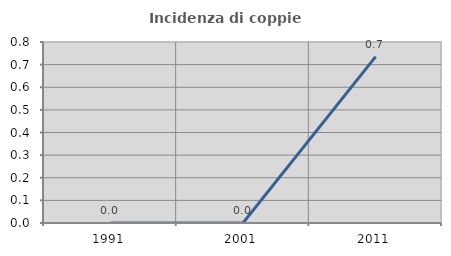
| Category | Incidenza di coppie miste |
|---|---|
| 1991.0 | 0 |
| 2001.0 | 0 |
| 2011.0 | 0.735 |